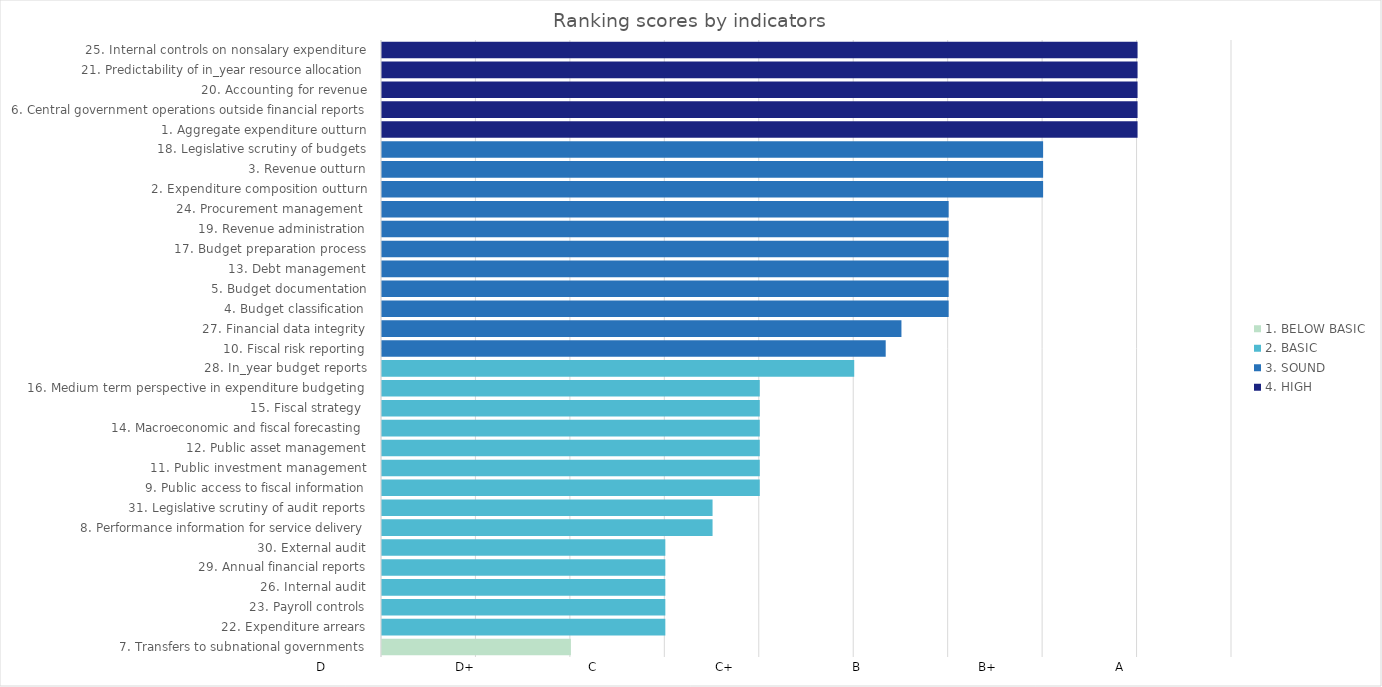
| Category | 4. HIGH | 3. SOUND | 2. BASIC | 1. BELOW BASIC |
|---|---|---|---|---|
| 7. Transfers to subnational governments  | 0 | 0 | 0 | 1 |
| 22. Expenditure arrears  | 0 | 0 | 1.5 | 0 |
| 23. Payroll controls  | 0 | 0 | 1.5 | 0 |
| 26. Internal audit  | 0 | 0 | 1.5 | 0 |
| 29. Annual financial reports  | 0 | 0 | 1.5 | 0 |
| 30. External audit  | 0 | 0 | 1.5 | 0 |
| 8. Performance information for service delivery  | 0 | 0 | 1.75 | 0 |
| 31. Legislative scrutiny of audit reports  | 0 | 0 | 1.75 | 0 |
| 9. Public access to fiscal information  | 0 | 0 | 2 | 0 |
| 11. Public investment management  | 0 | 0 | 2 | 0 |
| 12. Public asset management  | 0 | 0 | 2 | 0 |
| 14. Macroeconomic and fiscal forecasting   | 0 | 0 | 2 | 0 |
| 15. Fiscal strategy   | 0 | 0 | 2 | 0 |
| 16. Medium term perspective in expenditure budgeting   | 0 | 0 | 2 | 0 |
| 28. In_year budget reports  | 0 | 0 | 2.5 | 0 |
| 10. Fiscal risk reporting  | 0 | 2.667 | 0 | 0 |
| 27. Financial data integrity  | 0 | 2.75 | 0 | 0 |
| 4. Budget classification  | 0 | 3 | 0 | 0 |
| 5. Budget documentation  | 0 | 3 | 0 | 0 |
| 13. Debt management  | 0 | 3 | 0 | 0 |
| 17. Budget preparation process  | 0 | 3 | 0 | 0 |
| 19. Revenue administration  | 0 | 3 | 0 | 0 |
| 24. Procurement management   | 0 | 3 | 0 | 0 |
| 2. Expenditure composition outturn  | 0 | 3.5 | 0 | 0 |
| 3. Revenue outturn  | 0 | 3.5 | 0 | 0 |
| 18. Legislative scrutiny of budgets  | 0 | 3.5 | 0 | 0 |
| 1. Aggregate expenditure outturn  | 4 | 0 | 0 | 0 |
| 6. Central government operations outside financial reports  | 4 | 0 | 0 | 0 |
| 20. Accounting for revenue  | 4 | 0 | 0 | 0 |
| 21. Predictability of in_year resource allocation  | 4 | 0 | 0 | 0 |
| 25. Internal controls on nonsalary expenditure  | 4 | 0 | 0 | 0 |